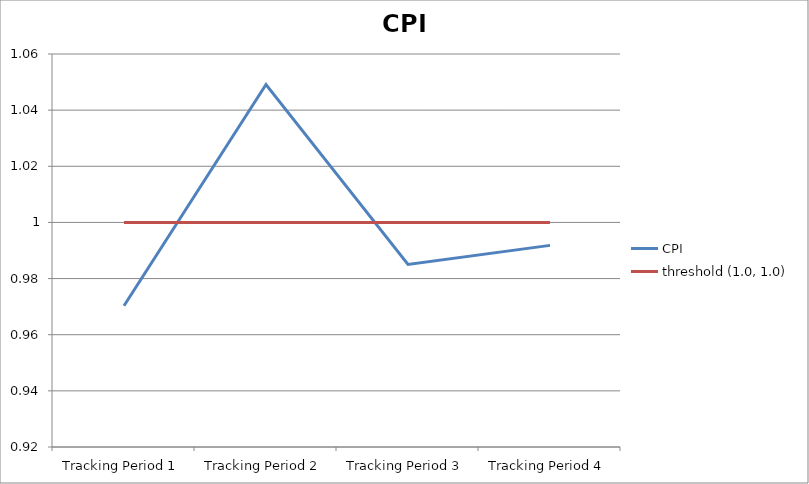
| Category | CPI | threshold (1.0, 1.0) |
|---|---|---|
| Tracking Period 1 | 0.97 | 1 |
| Tracking Period 2 | 1.049 | 1 |
| Tracking Period 3 | 0.985 | 1 |
| Tracking Period 4 | 0.992 | 1 |